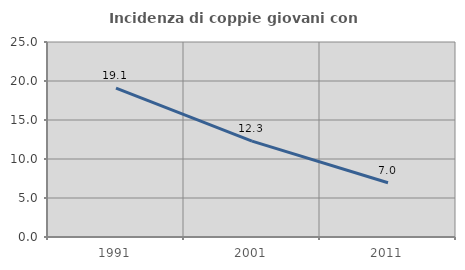
| Category | Incidenza di coppie giovani con figli |
|---|---|
| 1991.0 | 19.084 |
| 2001.0 | 12.295 |
| 2011.0 | 6.957 |